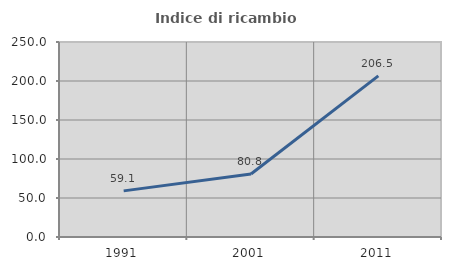
| Category | Indice di ricambio occupazionale  |
|---|---|
| 1991.0 | 59.146 |
| 2001.0 | 80.824 |
| 2011.0 | 206.522 |